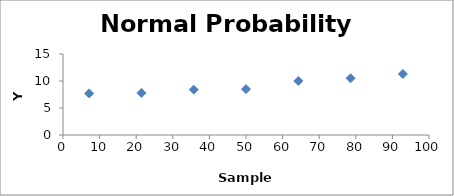
| Category | Series 0 |
|---|---|
| 7.142857142857143 | 7.7 |
| 21.42857142857143 | 7.8 |
| 35.714285714285715 | 8.4 |
| 50.00000000000001 | 8.5 |
| 64.28571428571429 | 10 |
| 78.57142857142857 | 10.5 |
| 92.85714285714286 | 11.3 |